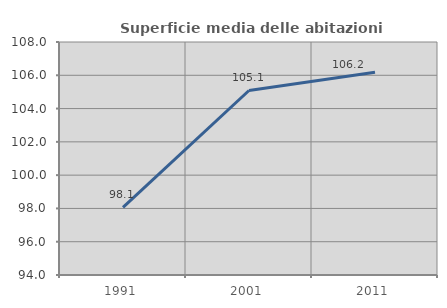
| Category | Superficie media delle abitazioni occupate |
|---|---|
| 1991.0 | 98.067 |
| 2001.0 | 105.087 |
| 2011.0 | 106.177 |